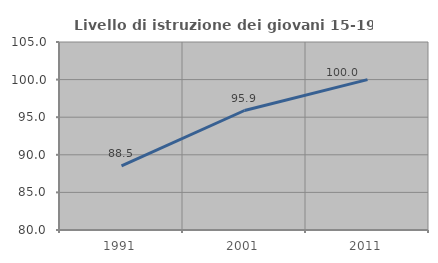
| Category | Livello di istruzione dei giovani 15-19 anni |
|---|---|
| 1991.0 | 88.525 |
| 2001.0 | 95.89 |
| 2011.0 | 100 |